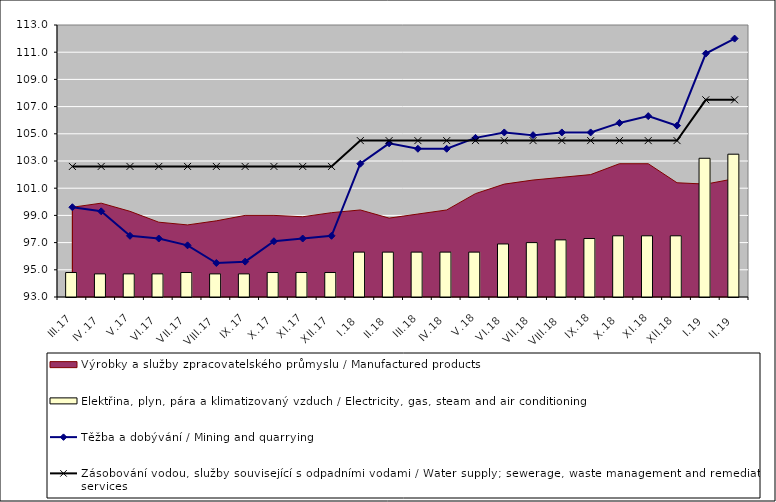
| Category | Elektřina, plyn, pára a klimatizovaný vzduch / Electricity, gas, steam and air conditioning |
|---|---|
| III.17 | 94.8 |
| IV.17 | 94.7 |
| V.17 | 94.7 |
| VI.17 | 94.7 |
| VII.17 | 94.8 |
| VIII.17 | 94.7 |
| IX.17 | 94.7 |
| X.17 | 94.8 |
| XI.17 | 94.8 |
| XII.17 | 94.8 |
| I.18 | 96.3 |
| II.18 | 96.3 |
| III.18 | 96.3 |
| IV.18 | 96.3 |
| V.18 | 96.3 |
| VI.18 | 96.9 |
| VII.18 | 97 |
| VIII.18 | 97.2 |
| IX.18 | 97.3 |
| X.18 | 97.5 |
| XI.18 | 97.5 |
| XII.18 | 97.5 |
| I.19 | 103.2 |
| II.19 | 103.5 |